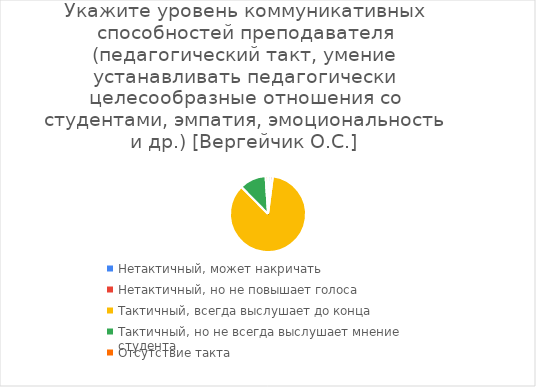
| Category | Series 0 |
|---|---|
| Нетактичный, может накричать | 1 |
| Нетактичный, но не повышает голоса | 1 |
| Тактичный, всегда выслушает до конца | 83 |
| Тактичный, но не всегда выслушает мнение студента | 11 |
| Отсутствие такта | 1 |